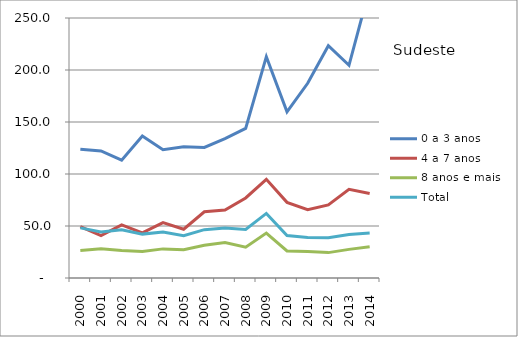
| Category | 0 a 3 anos | 4 a 7 anos | 8 anos e mais | Total |
|---|---|---|---|---|
| 2000.0 | 123.7 | 49.5 | 26.4 | 48.2 |
| 2001.0 | 122.2 | 40.7 | 28.1 | 44.3 |
| 2002.0 | 113.3 | 51 | 26.5 | 46.3 |
| 2003.0 | 136.6 | 43.4 | 25.4 | 42.2 |
| 2004.0 | 123.4 | 53.3 | 28 | 44.2 |
| 2005.0 | 126.2 | 46.9 | 27.2 | 40.7 |
| 2006.0 | 125.6 | 63.7 | 31.4 | 46.5 |
| 2007.0 | 134.1 | 65.3 | 34.1 | 48.1 |
| 2008.0 | 143.9 | 77 | 29.6 | 46.7 |
| 2009.0 | 212.8 | 94.9 | 43.2 | 62.1 |
| 2010.0 | 159.749 | 72.723 | 26.063 | 40.826 |
| 2011.0 | 187.231 | 65.662 | 25.386 | 38.972 |
| 2012.0 | 223.389 | 70.233 | 24.415 | 38.771 |
| 2013.0 | 204.528 | 85.256 | 27.521 | 41.823 |
| 2014.0 | 278.679 | 81.225 | 30.1 | 43.25 |